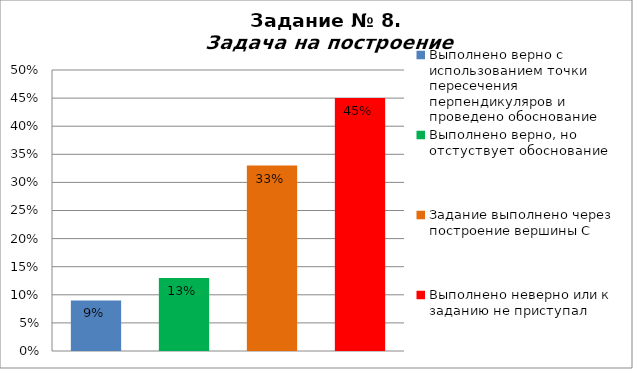
| Category | Задача на построение |
|---|---|
| Выполнено верно с использованием точки пересечения перпендикуляров и проведено обоснование | 0.09 |
| Выполнено верно, но отстуствует обоснование | 0.13 |
| Задание выполнено через построение вершины С | 0.33 |
| Выполнено неверно или к заданию не приступал | 0.45 |